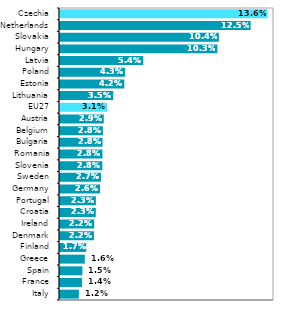
| Category | Series 0 |
|---|---|
| Italy | 0.012 |
| France | 0.014 |
| Spain | 0.015 |
| Greece | 0.016 |
| Finland | 0.017 |
| Denmark | 0.022 |
| Ireland | 0.022 |
| Croatia | 0.023 |
| Portugal | 0.023 |
| Germany | 0.026 |
| Sweden | 0.027 |
| Slovenia | 0.028 |
| Romania | 0.028 |
| Bulgaria | 0.028 |
| Belgium | 0.028 |
| Austria | 0.029 |
| EU27 | 0.031 |
| Lithuania | 0.035 |
| Estonia | 0.042 |
| Poland | 0.043 |
| Latvia | 0.054 |
| Hungary | 0.103 |
| Slovakia | 0.104 |
| Netherlands | 0.125 |
| Czechia | 0.136 |